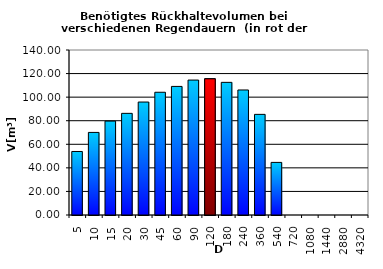
| Category | Series 0 |
|---|---|
| 5.0 | 53.904 |
| 10.0 | 70.075 |
| 15.0 | 79.67 |
| 20.0 | 86.246 |
| 30.0 | 95.841 |
| 45.0 | 104.142 |
| 60.0 | 109.101 |
| 90.0 | 114.492 |
| 120.0 | 115.57 |
| 180.0 | 112.551 |
| 240.0 | 106.083 |
| 360.0 | 85.384 |
| 540.0 | 44.632 |
| 720.0 | 0 |
| 1080.0 | 0 |
| 1440.0 | 0 |
| 2880.0 | 0 |
| 4320.0 | 0 |